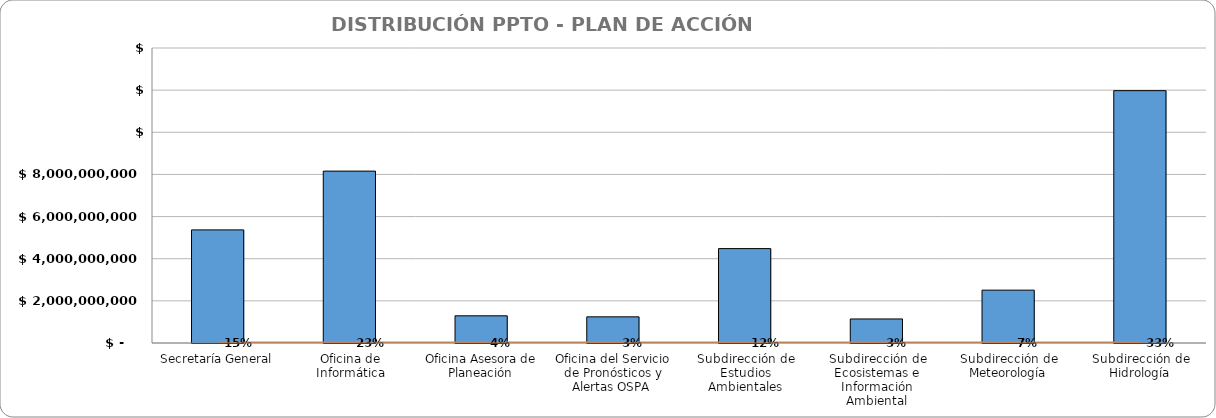
| Category | TOTAL |
|---|---|
| Secretaría General | 5368086310 |
| Oficina de Informática | 8156963250 |
| Oficina Asesora de Planeación | 1289605860 |
| Oficina del Servicio de Pronósticos y Alertas OSPA  | 1241005600 |
| Subdirección de Estudios Ambientales | 4480000000 |
| Subdirección de Ecosistemas e Información Ambiental | 1140947597 |
| Subdirección de Meteorología | 2508521476 |
| Subdirección de Hidrología | 11975855389 |